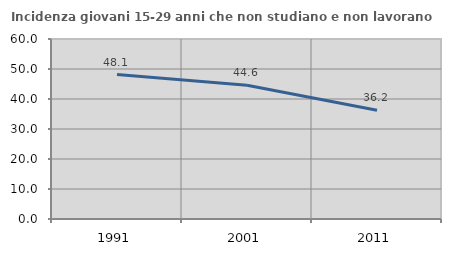
| Category | Incidenza giovani 15-29 anni che non studiano e non lavorano  |
|---|---|
| 1991.0 | 48.148 |
| 2001.0 | 44.607 |
| 2011.0 | 36.23 |